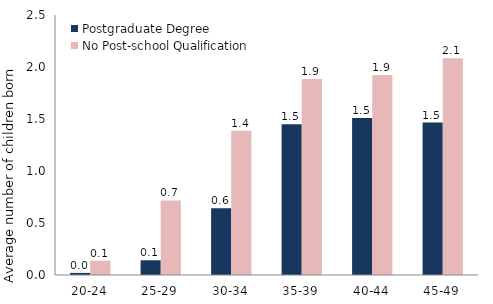
| Category | Postgraduate Degree | No Post-school Qualification |
|---|---|---|
| 20-24 | 0.02 | 0.138 |
| 25-29 | 0.142 | 0.717 |
| 30-34 | 0.643 | 1.388 |
| 35-39 | 1.45 | 1.884 |
| 40-44 | 1.51 | 1.922 |
| 45-49 | 1.466 | 2.085 |